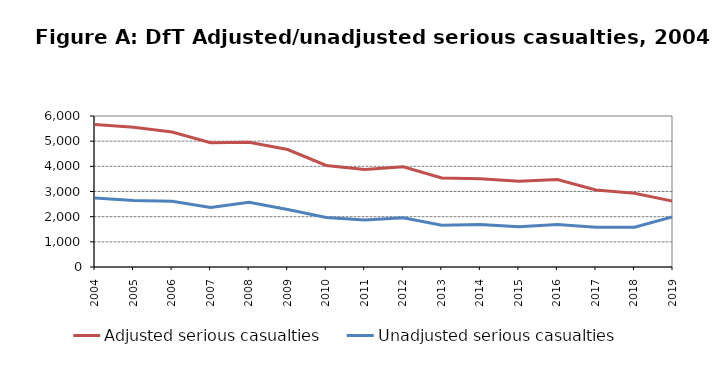
| Category | Adjusted serious casualties | Unadjusted serious casualties |
|---|---|---|
| 0 | 5662 | 2741 |
| 1 | 5553 | 2643 |
| 2 | 5365 | 2614 |
| 3 | 4939 | 2364 |
| 4 | 4959 | 2571 |
| 5 | 4667 | 2281 |
| 6 | 4033 | 1964 |
| 7 | 3872 | 1871 |
| 8 | 3986 | 1956 |
| 9 | 3540 | 1662 |
| 10 | 3510 | 1691 |
| 11 | 3408 | 1597 |
| 12 | 3473 | 1693 |
| 13 | 3063 | 1577 |
| 14 | 2933 | 1580 |
| 15 | 2611 | 1998 |